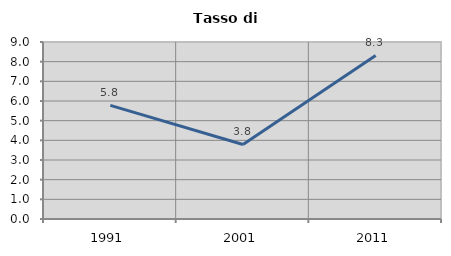
| Category | Tasso di disoccupazione   |
|---|---|
| 1991.0 | 5.778 |
| 2001.0 | 3.788 |
| 2011.0 | 8.32 |